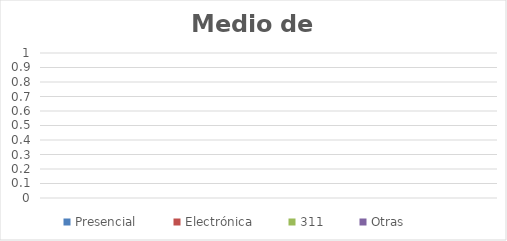
| Category | Presencial | Electrónica | 311 | Otras |
|---|---|---|---|---|
| 0 | 0 | 0 | 0 | 0 |